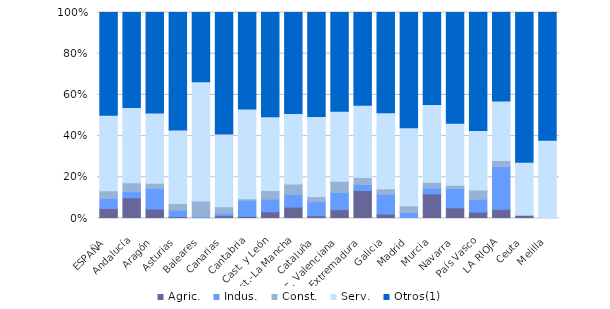
| Category | Agric. | Indus. | Const. | Serv. | Otros(1) |
|---|---|---|---|---|---|
| ESPAÑA | 4.815 | 4.884 | 3.796 | 36.667 | 49.838 |
| Andalucía | 10.041 | 3.007 | 4.288 | 36.554 | 46.124 |
| Aragón | 4.613 | 10.049 | 2.471 | 34.102 | 48.764 |
| Asturias | 0.936 | 3.12 | 3.276 | 35.569 | 57.098 |
| Baleares | 0 | 1.001 | 7.439 | 57.94 | 33.619 |
| Canarias | 1.361 | 1.183 | 3.136 | 35.325 | 59.053 |
| Cantabria | 1.068 | 7.829 | 0.712 | 43.772 | 46.975 |
| Cast. y León | 3.255 | 6.104 | 4.171 | 35.809 | 50.56 |
| Cast.-La Mancha | 5.525 | 6.071 | 5.116 | 34.243 | 49.045 |
| Cataluña | 1.369 | 6.741 | 2.531 | 38.869 | 50.491 |
| C. Valenciana | 4.291 | 8.381 | 5.415 | 33.929 | 47.984 |
| Extremadura | 13.594 | 2.88 | 3.456 | 35.138 | 45.046 |
| Galicia | 2.131 | 9.589 | 2.664 | 36.91 | 48.63 |
| Madrid | 0 | 2.914 | 3.227 | 37.982 | 55.901 |
| Murcia | 11.922 | 2.878 | 2.775 | 37.821 | 44.604 |
| Navarra | 5.167 | 9.422 | 1.52 | 30.091 | 53.799 |
| País Vasco | 3.111 | 6.222 | 4.556 | 28.778 | 57.333 |
| LA RIOJA | 4.38 | 20.438 | 2.92 | 28.467 | 42.336 |
| Ceuta | 1.562 | 0 | 0 | 25.781 | 72.656 |
| Melilla | 0 | 0 | 0 | 37.975 | 62.025 |